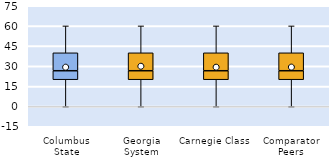
| Category | 25th | 50th | 75th |
|---|---|---|---|
| Columbus State | 20 | 6.667 | 13.333 |
| Georgia System | 20 | 6.667 | 13.333 |
| Carnegie Class | 20 | 6.667 | 13.333 |
| Comparator Peers | 20 | 6.667 | 13.333 |